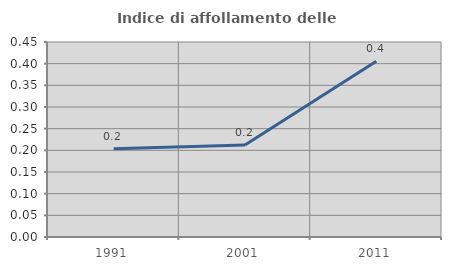
| Category | Indice di affollamento delle abitazioni  |
|---|---|
| 1991.0 | 0.204 |
| 2001.0 | 0.212 |
| 2011.0 | 0.406 |